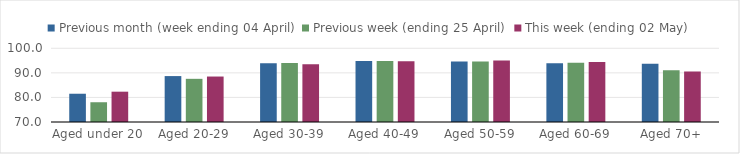
| Category | Previous month (week ending 04 April) | Previous week (ending 25 April) | This week (ending 02 May) |
|---|---|---|---|
| Aged under 20 | 81.503 | 78.043 | 82.34 |
| Aged 20-29 | 88.689 | 87.571 | 88.503 |
| Aged 30-39 | 93.87 | 93.99 | 93.483 |
| Aged 40-49 | 94.835 | 94.793 | 94.683 |
| Aged 50-59 | 94.594 | 94.605 | 95.031 |
| Aged 60-69 | 93.952 | 94.093 | 94.443 |
| Aged 70+ | 93.732 | 91.1 | 90.556 |